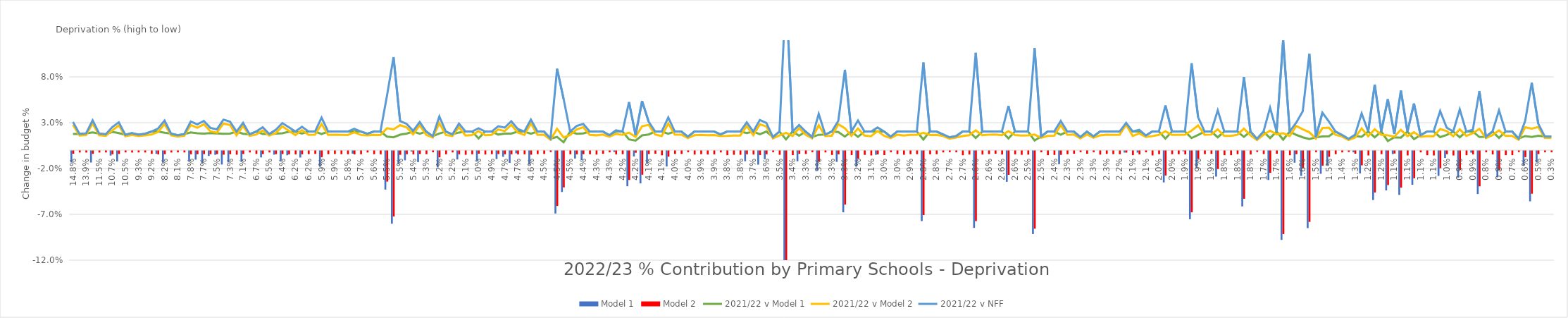
| Category | Model 1 | Model 2 |
|---|---|---|
| 0.14839999627566164 | -0.013 | -0.003 |
| 0.14173180336089433 | 0 | -0.002 |
| 0.13922041423017217 | 0 | -0.002 |
| 0.13743850112541273 | -0.013 | -0.003 |
| 0.11481517517842445 | 0 | -0.002 |
| 0.10750389831027776 | 0 | -0.002 |
| 0.10745222343969978 | -0.005 | -0.004 |
| 0.10508486481511936 | -0.012 | -0.003 |
| 0.10497656521066158 | 0 | -0.002 |
| 0.097335596581713 | 0 | -0.002 |
| 0.09271587225369564 | 0 | -0.002 |
| 0.0925624430848895 | 0 | -0.002 |
| 0.09225409294558998 | 0 | -0.003 |
| 0.08472311190587302 | -0.003 | -0.004 |
| 0.08150002963109691 | -0.013 | -0.004 |
| 0.08130663595802809 | 0 | -0.002 |
| 0.08069040698949029 | 0 | -0.002 |
| 0.080006867947658 | 0 | -0.002 |
| 0.07818409319276849 | -0.011 | -0.004 |
| 0.07729973149241355 | -0.01 | -0.004 |
| 0.07695743401424487 | -0.013 | -0.004 |
| 0.07640524702145612 | -0.006 | -0.004 |
| 0.07537690099327489 | -0.004 | -0.003 |
| 0.07458079992505967 | -0.015 | -0.004 |
| 0.07258332757899859 | -0.013 | -0.004 |
| 0.07170942627646487 | 0 | -0.004 |
| 0.07135050578557312 | -0.012 | -0.003 |
| 0.0697647404818165 | 0 | -0.002 |
| 0.0668323845629703 | 0 | -0.003 |
| 0.06659680563818028 | -0.007 | -0.003 |
| 0.06481193777398973 | 0 | -0.002 |
| 0.06480500708010745 | -0.004 | -0.003 |
| 0.06400513439924488 | -0.011 | -0.003 |
| 0.0631147931645134 | -0.005 | -0.004 |
| 0.06244452007741852 | 0 | -0.004 |
| 0.06185271626741469 | -0.007 | -0.004 |
| 0.061806549123364515 | 0 | -0.004 |
| 0.06084733679776245 | 0 | -0.003 |
| 0.0591678464280146 | -0.017 | -0.007 |
| 0.05893334750420737 | 0 | -0.004 |
| 0.05881435373432292 | 0 | -0.003 |
| 0.05859009514761559 | 0 | -0.004 |
| 0.058274836736643444 | 0 | -0.004 |
| 0.05810577683194181 | -0.003 | -0.004 |
| 0.057490083403032154 | 0 | -0.004 |
| 0.05631681169551002 | 0 | -0.002 |
| 0.056119813530065274 | 0 | -0.004 |
| 0.05560627421864644 | 0 | -0.004 |
| 0.05521592728164681 | -0.042 | -0.034 |
| 0.054933523630686557 | -0.079 | -0.072 |
| 0.054743086936502074 | -0.014 | -0.004 |
| 0.05443596072388197 | -0.01 | -0.004 |
| 0.053821305071366204 | -0.001 | -0.004 |
| 0.053551153091139815 | -0.012 | -0.003 |
| 0.052622400900458076 | 0 | -0.004 |
| 0.052107066560690786 | 0 | -0.002 |
| 0.05204918595177106 | -0.018 | -0.007 |
| 0.051720329435207685 | 0 | -0.004 |
| 0.05155955740573944 | 0 | -0.002 |
| 0.05152239337844778 | -0.009 | -0.004 |
| 0.051034432327373494 | 0 | -0.004 |
| 0.05054582781616311 | 0 | -0.004 |
| 0.04964029082651101 | -0.011 | -0.003 |
| 0.04953386986979259 | 0 | -0.004 |
| 0.04904985116943708 | 0 | -0.004 |
| 0.04869652026594171 | -0.009 | -0.003 |
| 0.0474430231594936 | -0.006 | -0.004 |
| 0.047049699237320546 | -0.013 | -0.004 |
| 0.0469512938812837 | -0.003 | -0.004 |
| 0.04650497177488398 | 0 | -0.004 |
| 0.04613783824820066 | -0.015 | -0.004 |
| 0.04589179946631672 | 0 | -0.003 |
| 0.04547055381273885 | 0 | -0.003 |
| 0.04521158440641354 | 0 | -0.001 |
| 0.04489457852894712 | -0.068 | -0.06 |
| 0.04480730329892401 | -0.045 | -0.04 |
| 0.0447624692220068 | 0 | -0.004 |
| 0.04385996429653746 | -0.008 | -0.004 |
| 0.04384876020186898 | -0.01 | -0.004 |
| 0.04383159891260515 | 0 | -0.004 |
| 0.043397537081893166 | 0 | -0.004 |
| 0.042937426743057616 | 0 | -0.003 |
| 0.04257556061826024 | 0 | -0.002 |
| 0.042101360436884366 | -0.001 | -0.004 |
| 0.041966956076335986 | 0 | -0.004 |
| 0.04182341044075511 | -0.039 | -0.032 |
| 0.04167026480058638 | -0.006 | -0.002 |
| 0.041251005454518666 | -0.035 | -0.026 |
| 0.04100939619777392 | -0.014 | -0.003 |
| 0.04097374514689184 | 0 | -0.003 |
| 0.04084833771106495 | 0 | -0.005 |
| 0.040737368995470605 | -0.017 | -0.006 |
| 0.04045567808936563 | 0 | -0.003 |
| 0.04000729224733639 | 0 | -0.003 |
| 0.03956468343535341 | 0 | -0.001 |
| 0.03951443231215613 | 0 | -0.004 |
| 0.03935441877388036 | 0 | -0.004 |
| 0.039214653309731035 | 0 | -0.004 |
| 0.039192759683182775 | 0 | -0.004 |
| 0.03869748767960569 | 0 | -0.002 |
| 0.038432976300027864 | 0 | -0.005 |
| 0.03833193541464745 | 0 | -0.004 |
| 0.03756451440810756 | 0 | -0.004 |
| 0.037054239741036395 | -0.011 | -0.004 |
| 0.03659661176493337 | 0 | -0.004 |
| 0.03613480052490328 | -0.015 | -0.005 |
| 0.036110138762235344 | -0.009 | -0.004 |
| 0.035751797677359684 | 0 | -0.001 |
| 0.035188874288411345 | 0 | -0.004 |
| 0.03485448795723655 | -0.139 | -0.133 |
| 0.034338627123126186 | 0 | -0.005 |
| 0.03360942175151236 | -0.011 | -0.003 |
| 0.0334509115991436 | 0 | -0.003 |
| 0.03338385627313341 | 0 | -0.001 |
| 0.03325453516561968 | -0.022 | -0.012 |
| 0.033199981686098154 | 0 | -0.002 |
| 0.032962952530578266 | 0 | -0.004 |
| 0.03274351946854093 | -0.012 | -0.004 |
| 0.032524337412609565 | -0.067 | -0.059 |
| 0.03186884488423613 | 0 | -0.005 |
| 0.03180475650395892 | -0.017 | -0.008 |
| 0.0313622234384396 | 0 | -0.004 |
| 0.031297768647799915 | 0 | -0.005 |
| 0.030899623252443883 | -0.004 | -0.004 |
| 0.030137162079980025 | 0 | -0.005 |
| 0.030123340106565054 | 0 | -0.001 |
| 0.029856404511358944 | 0 | -0.003 |
| 0.02966867524668165 | 0 | -0.004 |
| 0.02905152417853218 | 0 | -0.004 |
| 0.028170893979912483 | 0 | -0.004 |
| 0.027842517072908444 | -0.077 | -0.07 |
| 0.027652974404360493 | 0 | -0.004 |
| 0.027586930036549516 | 0 | -0.004 |
| 0.027177813830210135 | 0 | -0.002 |
| 0.02717778983793193 | 0 | -0.001 |
| 0.02715941121172832 | 0 | -0.002 |
| 0.026727100987686853 | 0 | -0.005 |
| 0.02649413270675135 | 0 | -0.004 |
| 0.026266791773576943 | -0.084 | -0.077 |
| 0.026114942429280644 | 0 | -0.004 |
| 0.025997568766148813 | 0 | -0.003 |
| 0.025896208211245858 | 0 | -0.003 |
| 0.025724539454142565 | 0 | -0.004 |
| 0.025717884626625703 | -0.034 | -0.026 |
| 0.025522559171960946 | 0 | -0.004 |
| 0.02517102658832234 | 0 | -0.004 |
| 0.02491552144107822 | 0 | -0.004 |
| 0.024726957646974124 | -0.091 | -0.085 |
| 0.024665393195624295 | 0 | -0.001 |
| 0.024388777062543526 | 0 | -0.005 |
| 0.024000933207609536 | 0 | -0.004 |
| 0.02395410619565092 | -0.015 | -0.004 |
| 0.023491454190673246 | 0 | -0.004 |
| 0.023360650775435605 | 0 | -0.003 |
| 0.023178777542260273 | 0 | -0.001 |
| 0.02294008790584728 | 0 | -0.003 |
| 0.022853033136142183 | 0 | -0.001 |
| 0.022661688058382333 | 0 | -0.004 |
| 0.022559426278169606 | 0 | -0.003 |
| 0.02247161727916365 | 0 | -0.004 |
| 0.02242567798106282 | 0 | -0.004 |
| 0.021839695830779732 | -0.002 | -0.002 |
| 0.02135975590669405 | 0 | -0.005 |
| 0.02102784057203315 | -0.002 | -0.004 |
| 0.020880290608765766 | 0 | -0.002 |
| 0.020714765958655696 | 0 | -0.005 |
| 0.020125554917574614 | 0 | -0.004 |
| 0.02005449965322418 | -0.034 | -0.027 |
| 0.019905889525883874 | 0 | -0.004 |
| 0.019706398229010297 | 0 | -0.004 |
| 0.019457191639882788 | 0 | -0.004 |
| 0.01939083222977425 | -0.075 | -0.067 |
| 0.019187623993873543 | -0.019 | -0.009 |
| 0.018911741021079266 | 0 | -0.003 |
| 0.018866192534827696 | 0 | -0.003 |
| 0.018616100114148732 | -0.028 | -0.02 |
| 0.018356599340610742 | 0 | -0.005 |
| 0.018260894421027407 | 0 | -0.005 |
| 0.018161110494943882 | 0 | -0.004 |
| 0.017972534881212143 | -0.061 | -0.052 |
| 0.017619827267752373 | 0 | -0.004 |
| 0.017553477295272943 | 0 | -0.001 |
| 0.017377350255349058 | 0 | -0.003 |
| 0.017293676448323372 | -0.032 | -0.024 |
| 0.017201176751155234 | 0 | -0.003 |
| 0.017006191962962335 | -0.097 | -0.091 |
| 0.01641233035399968 | 0 | -0.005 |
| 0.015918253591165103 | -0.013 | -0.004 |
| 0.015567081650049828 | -0.027 | -0.019 |
| 0.015493726419753627 | -0.084 | -0.077 |
| 0.015447072515025934 | 0 | -0.001 |
| 0.01527858084304637 | -0.025 | -0.016 |
| 0.015180571295224337 | -0.016 | -0.006 |
| 0.0145754271895323 | 0 | -0.004 |
| 0.014479043948996406 | 0 | -0.002 |
| 0.01398487438431458 | 0 | -0.001 |
| 0.013407759672899177 | -0.002 | -0.003 |
| 0.012842968651151474 | -0.025 | -0.016 |
| 0.012499666550436866 | 0 | -0.005 |
| 0.01227795681873696 | -0.054 | -0.045 |
| 0.011942240308711275 | 0 | -0.004 |
| 0.011855287256673185 | -0.043 | -0.037 |
| 0.01144399846745927 | -0.003 | -0.003 |
| 0.011367828692178944 | -0.048 | -0.04 |
| 0.011219352178715137 | 0 | -0.005 |
| 0.010944425989620038 | -0.037 | -0.03 |
| 0.010933099366531918 | 0 | -0.002 |
| 0.010715215324669332 | 0 | -0.005 |
| 0.010682468985998112 | 0 | -0.005 |
| 0.009705235887428993 | -0.027 | -0.019 |
| 0.00951507542359047 | -0.008 | -0.004 |
| 0.009234752033384204 | 0 | -0.005 |
| 0.009124038799724588 | -0.029 | -0.021 |
| 0.00904058488692208 | 0 | -0.005 |
| 0.008915910150073285 | -0.002 | -0.004 |
| 0.008855106552785994 | -0.047 | -0.039 |
| 0.008477416215132306 | 0 | -0.001 |
| 0.007651651556418151 | 0 | -0.004 |
| 0.00750216661078859 | -0.029 | -0.021 |
| 0.0072949782028245225 | 0 | -0.005 |
| 0.006582412523886139 | 0 | -0.005 |
| 0.0063535383760193 | 0 | -0.001 |
| 0.005750305558543095 | -0.016 | -0.007 |
| 0.004835960374203232 | -0.055 | -0.047 |
| 0.004637468066085422 | -0.013 | -0.003 |
| 0.004311794677285184 | 0 | -0.001 |
| 0.0028001758957665423 | 0 | -0.001 |